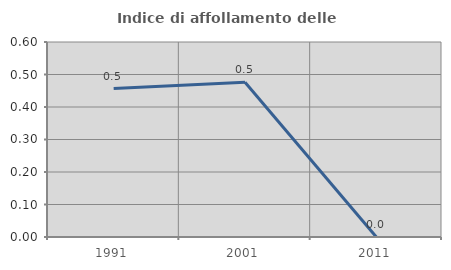
| Category | Indice di affollamento delle abitazioni  |
|---|---|
| 1991.0 | 0.457 |
| 2001.0 | 0.476 |
| 2011.0 | 0 |